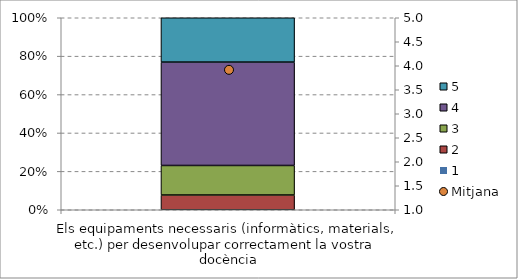
| Category | 1 | 2 | 3 | 4 | 5 |
|---|---|---|---|---|---|
| Els equipaments necessaris (informàtics, materials, etc.) per desenvolupar correctament la vostra docència | 0 | 0.077 | 0.154 | 0.538 | 0.231 |